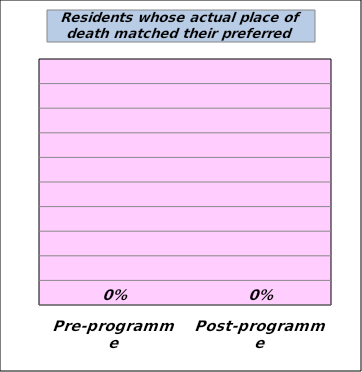
| Category | Series 0 |
|---|---|
| Pre-programme | 0 |
| Post-programme | 0 |